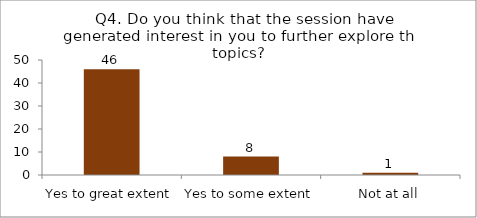
| Category | Q4. Do you think that the session have generated interest in you to further explore the topics? |
|---|---|
| Yes to great extent | 46 |
| Yes to some extent | 8 |
| Not at all | 1 |